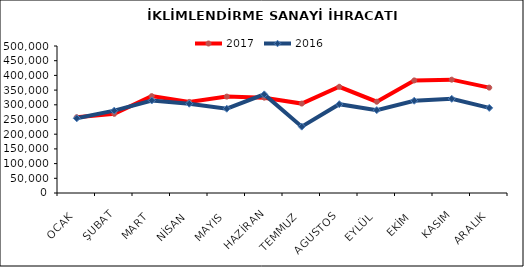
| Category | 2017 | 2016 |
|---|---|---|
| OCAK | 257701.45 | 254117.769 |
| ŞUBAT | 269349.11 | 280094.71 |
| MART | 329519.413 | 314644.749 |
| NİSAN | 309791.779 | 303604.244 |
| MAYIS | 327854.299 | 286639.189 |
| HAZİRAN | 324249.871 | 335506.225 |
| TEMMUZ | 304215.989 | 225691.472 |
| AGUSTOS | 361289.704 | 301999.779 |
| EYLÜL | 310502.256 | 281829.049 |
| EKİM | 382897.093 | 313788.016 |
| KASIM | 385494.361 | 320434.245 |
| ARALIK | 358482.38 | 289508.506 |